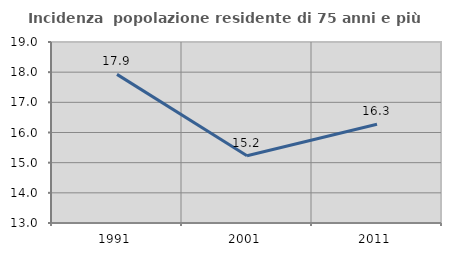
| Category | Incidenza  popolazione residente di 75 anni e più |
|---|---|
| 1991.0 | 17.926 |
| 2001.0 | 15.228 |
| 2011.0 | 16.275 |